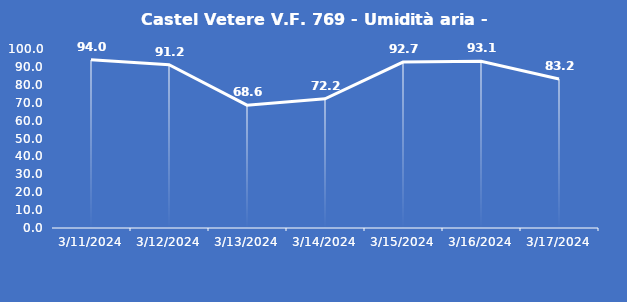
| Category | Castel Vetere V.F. 769 - Umidità aria - Grezzo (%) |
|---|---|
| 3/11/24 | 94 |
| 3/12/24 | 91.2 |
| 3/13/24 | 68.6 |
| 3/14/24 | 72.2 |
| 3/15/24 | 92.7 |
| 3/16/24 | 93.1 |
| 3/17/24 | 83.2 |